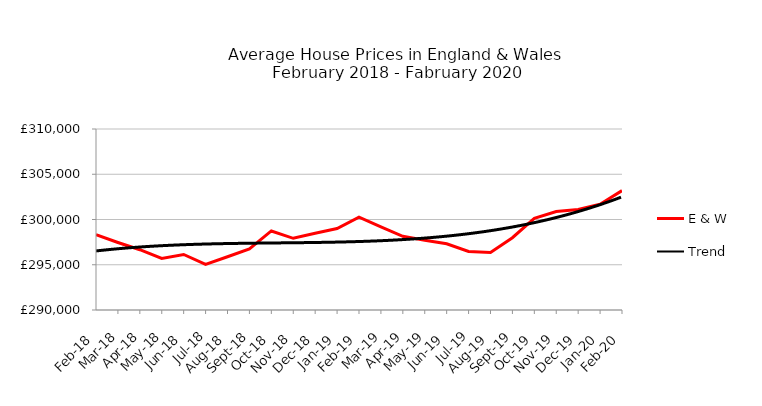
| Category | E & W |
|---|---|
| 2018-02-01 | 298313.44 |
| 2018-03-01 | 297460.703 |
| 2018-04-01 | 296660.349 |
| 2018-05-01 | 295704.696 |
| 2018-06-01 | 296136.927 |
| 2018-07-01 | 295042.264 |
| 2018-08-01 | 295883.669 |
| 2018-09-01 | 296762.15 |
| 2018-10-01 | 298734.437 |
| 2018-11-01 | 297922.604 |
| 2018-12-01 | 298472.392 |
| 2019-01-01 | 298998.19 |
| 2019-02-01 | 300254.526 |
| 2019-03-01 | 299193.89 |
| 2019-04-01 | 298148.043 |
| 2019-05-01 | 297703.175 |
| 2019-06-01 | 297319.497 |
| 2019-07-01 | 296464.042 |
| 2019-08-01 | 296366.098 |
| 2019-09-01 | 297989.486 |
| 2019-10-01 | 300120.562 |
| 2019-11-01 | 300889.787 |
| 2019-12-01 | 301113.205 |
| 2020-01-01 | 301688.221 |
| 2020-02-01 | 303189.445 |